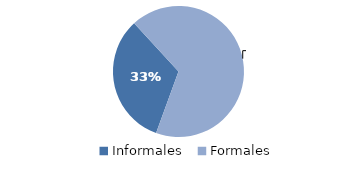
| Category | Series 0 |
|---|---|
| Informales | 1328.36 |
| Formales | 2746.651 |